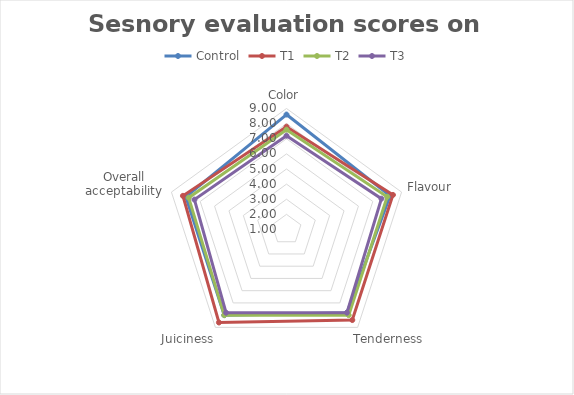
| Category | Control | T1 | T2 | T3 |
|---|---|---|---|---|
| Color | 8.6 | 7.8 | 7.6 | 7.2 |
| Flavour | 8.2 | 8.4 | 8 | 7.6 |
| Tenderness | 7.8 | 8.4 | 8 | 7.8 |
| Juiciness | 8 | 8.6 | 8 | 7.8 |
| Overall acceptability | 8 | 8.2 | 7.8 | 7.4 |